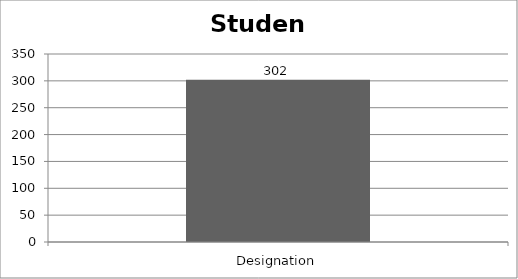
| Category | Student |
|---|---|
| Designation | 302 |